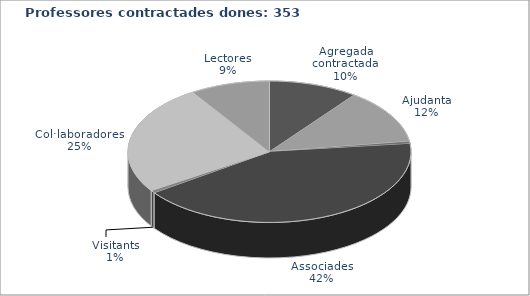
| Category | Agregada/at contractada/at Ajudant/a Catedràtic/a contractat Associades/ats Visitants Col·laboradores/ors  Lectors |
|---|---|
| Agregada/at contractada/at | 36 |
| Ajudant/a | 44 |
| Catedràtic/a contractat | 2 |
| Associades/ats | 148 |
| Visitants | 2 |
| Col·laboradores/ors  | 89 |
| Lectors | 32 |